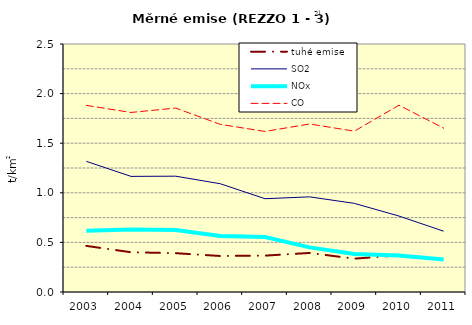
| Category | tuhé emise | SO2 | NOx | CO |
|---|---|---|---|---|
| 2003.0 | 0.465 | 1.317 | 0.617 | 1.881 |
| 2004.0 | 0.401 | 1.166 | 0.629 | 1.81 |
| 2005.0 | 0.391 | 1.168 | 0.624 | 1.854 |
| 2006.0 | 0.363 | 1.091 | 0.565 | 1.69 |
| 2007.0 | 0.367 | 0.94 | 0.554 | 1.618 |
| 2008.0 | 0.394 | 0.959 | 0.45 | 1.694 |
| 2009.0 | 0.336 | 0.893 | 0.384 | 1.621 |
| 2010.0 | 0.369 | 0.766 | 0.367 | 1.883 |
| 2011.0 | 0.324 | 0.613 | 0.327 | 1.651 |